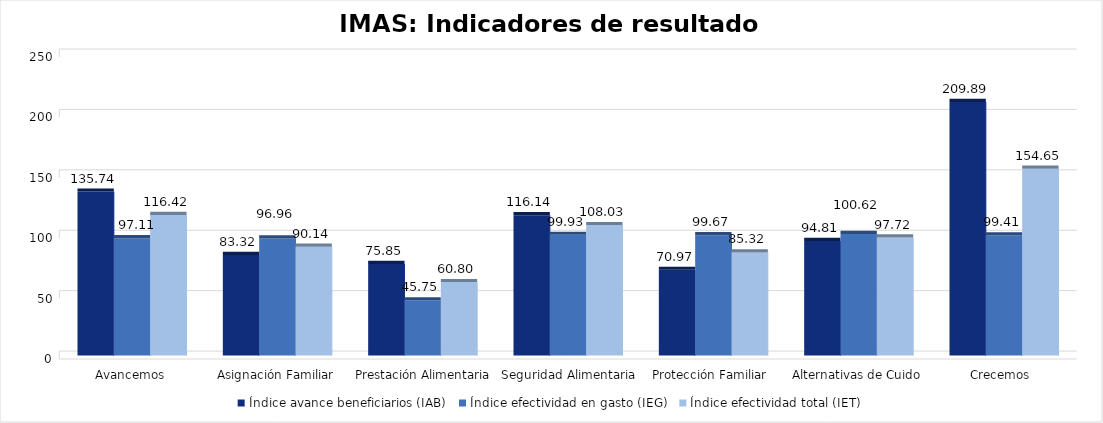
| Category | Índice avance beneficiarios (IAB)  | Índice efectividad en gasto (IEG)  | Índice efectividad total (IET) |
|---|---|---|---|
| Avancemos | 135.737 | 97.113 | 116.425 |
| Asignación Familiar | 83.316 | 96.964 | 90.14 |
| Prestación Alimentaria | 75.845 | 45.747 | 60.796 |
| Seguridad Alimentaria | 116.14 | 99.927 | 108.034 |
| Protección Familiar  | 70.968 | 99.667 | 85.317 |
| Alternativas de Cuido | 94.809 | 100.623 | 97.716 |
| Crecemos  | 209.885 | 99.407 | 154.646 |